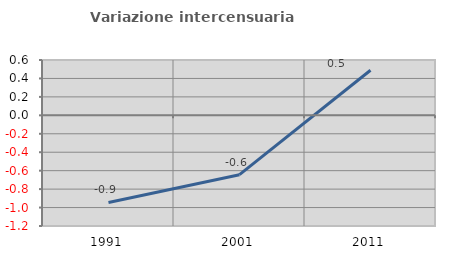
| Category | Variazione intercensuaria annua |
|---|---|
| 1991.0 | -0.945 |
| 2001.0 | -0.643 |
| 2011.0 | 0.489 |